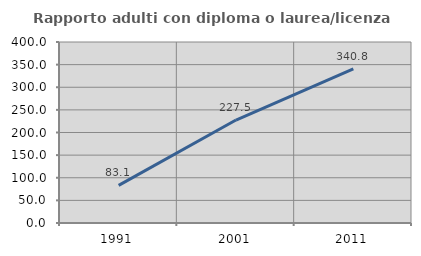
| Category | Rapporto adulti con diploma o laurea/licenza media  |
|---|---|
| 1991.0 | 83.144 |
| 2001.0 | 227.485 |
| 2011.0 | 340.798 |